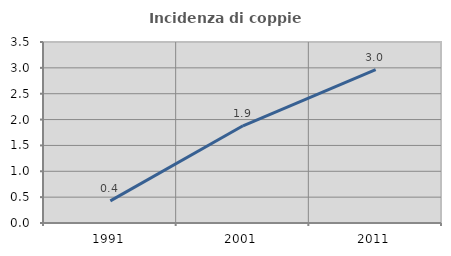
| Category | Incidenza di coppie miste |
|---|---|
| 1991.0 | 0.427 |
| 2001.0 | 1.879 |
| 2011.0 | 2.966 |